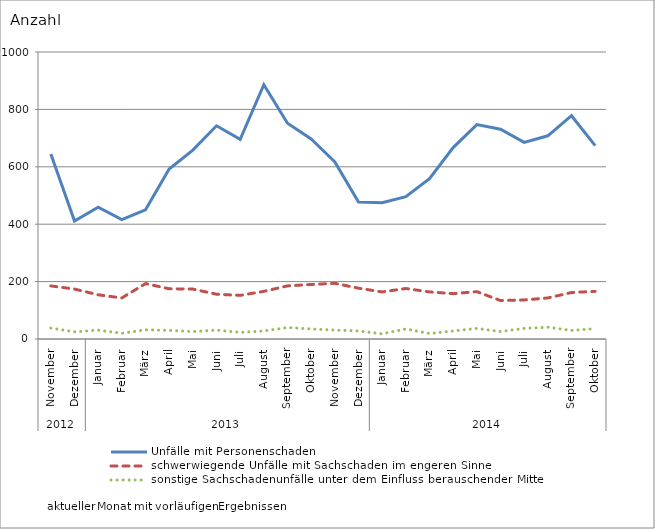
| Category | Unfälle mit Personenschaden | schwerwiegende Unfälle mit Sachschaden im engeren Sinne | sonstige Sachschadenunfälle unter dem Einfluss berauschender Mittel |
|---|---|---|---|
| 0 | 645 | 185 | 38 |
| 1 | 411 | 174 | 25 |
| 2 | 459 | 154 | 31 |
| 3 | 416 | 143 | 20 |
| 4 | 450 | 193 | 32 |
| 5 | 592 | 175 | 30 |
| 6 | 658 | 174 | 26 |
| 7 | 743 | 156 | 31 |
| 8 | 696 | 152 | 23 |
| 9 | 886 | 166 | 28 |
| 10 | 752 | 185 | 40 |
| 11 | 697 | 190 | 35 |
| 12 | 617 | 194 | 31 |
| 13 | 477 | 177 | 28 |
| 14 | 475 | 164 | 18 |
| 15 | 496 | 176 | 35 |
| 16 | 559 | 164 | 19 |
| 17 | 667 | 158 | 28 |
| 18 | 747 | 165 | 37 |
| 19 | 731 | 134 | 26 |
| 20 | 685 | 136 | 37 |
| 21 | 708 | 143 | 41 |
| 22 | 778 | 162 | 30 |
| 23 | 674 | 166 | 36 |